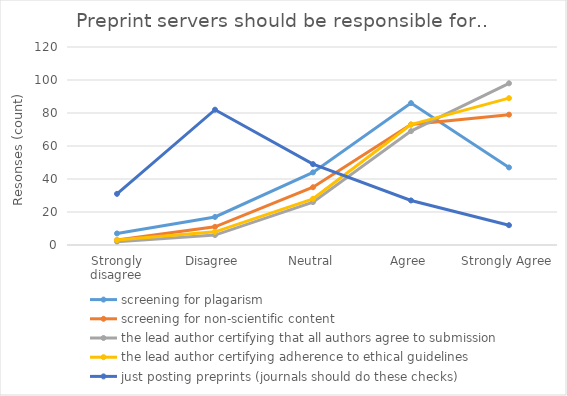
| Category | screening for plagarism | screening for non-scientific content | the lead author certifying that all authors agree to submission | the lead author certifying adherence to ethical guidelines | just posting preprints (journals should do these checks) |
|---|---|---|---|---|---|
| Strongly disagree | 7 | 3 | 2 | 3 | 31 |
| Disagree | 17 | 11 | 6 | 8 | 82 |
| Neutral | 44 | 35 | 26 | 28 | 49 |
| Agree | 86 | 73 | 69 | 73 | 27 |
| Strongly Agree | 47 | 79 | 98 | 89 | 12 |